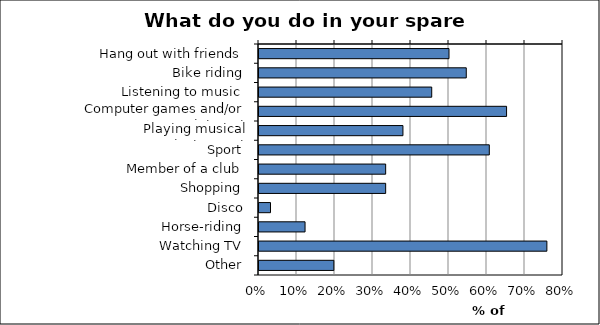
| Category | Series 0 |
|---|---|
| Hang out with friends | 0.5 |
| Bike riding | 0.545 |
| Listening to music | 0.455 |
| Computer games and/or internet | 0.652 |
| Playing musical instrument | 0.379 |
| Sport | 0.606 |
| Member of a club | 0.333 |
| Shopping | 0.333 |
| Disco | 0.03 |
| Horse-riding | 0.121 |
| Watching TV | 0.758 |
| Other | 0.197 |